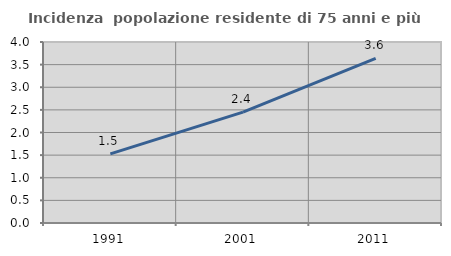
| Category | Incidenza  popolazione residente di 75 anni e più |
|---|---|
| 1991.0 | 1.527 |
| 2001.0 | 2.449 |
| 2011.0 | 3.636 |